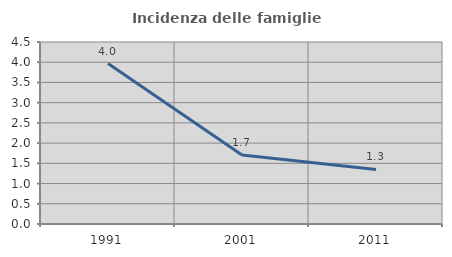
| Category | Incidenza delle famiglie numerose |
|---|---|
| 1991.0 | 3.967 |
| 2001.0 | 1.705 |
| 2011.0 | 1.349 |